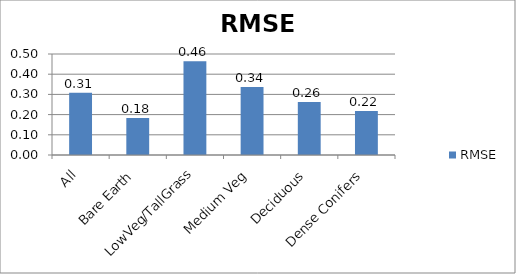
| Category | RMSE |
|---|---|
| All | 0.308 |
| Bare Earth | 0.183 |
| LowVeg/TallGrass | 0.464 |
| Medium Veg | 0.336 |
| Deciduous | 0.262 |
| Dense Conifers | 0.218 |